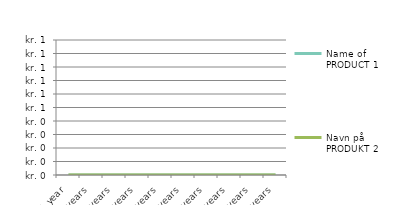
| Category | Name of PRODUCT 1 | Navn på PRODUKT 2 | Navn på PRODUKT 3 | Navn på PRODUKT 4 | Navn på PRODUKT 5 | Navn på PRODUKT 6 | Navn på PRODUKT 7 | Navn på PRODUKT 8 |
|---|---|---|---|---|---|---|---|---|
| 1 year | 0 | 0 |  |  |  |  |  |  |
| 2 years | 0 | 0 |  |  |  |  |  |  |
| 3 years | 0 | 0 |  |  |  |  |  |  |
| 4 years | 0 | 0 |  |  |  |  |  |  |
| 5 years | 0 | 0 |  |  |  |  |  |  |
| 6 years | 0 | 0 |  |  |  |  |  |  |
| 7 years | 0 | 0 |  |  |  |  |  |  |
| 8 years | 0 | 0 |  |  |  |  |  |  |
| 9 years | 0 | 0 |  |  |  |  |  |  |
| 10 years | 0 | 0 |  |  |  |  |  |  |